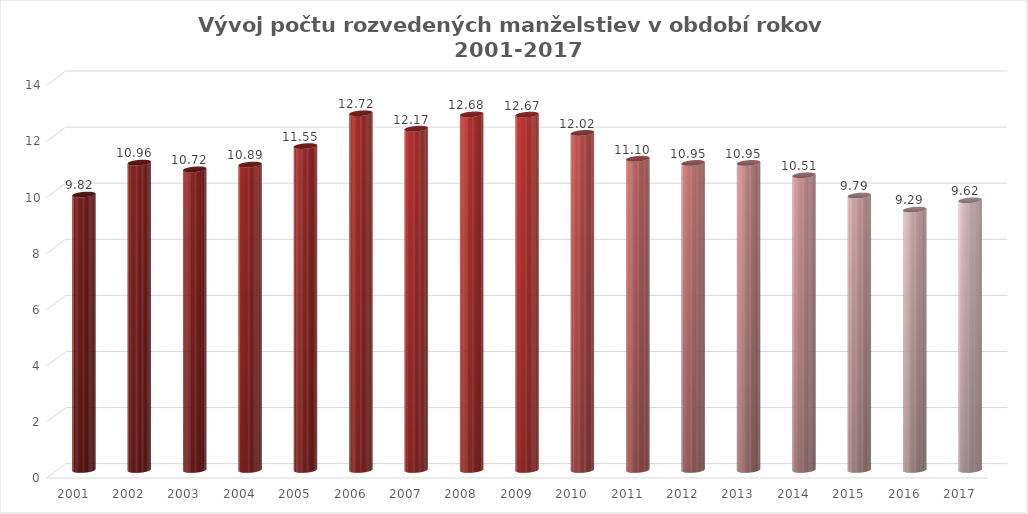
| Category | Series 1 |
|---|---|
| 2001.0 | 9.82 |
| 2002.0 | 10.96 |
| 2003.0 | 10.72 |
| 2004.0 | 10.89 |
| 2005.0 | 11.55 |
| 2006.0 | 12.72 |
| 2007.0 | 12.17 |
| 2008.0 | 12.68 |
| 2009.0 | 12.67 |
| 2010.0 | 12.02 |
| 2011.0 | 11.1 |
| 2012.0 | 10.95 |
| 2013.0 | 10.95 |
| 2014.0 | 10.51 |
| 2015.0 | 9.786 |
| 2016.0 | 9.286 |
| 2017.0 | 9.618 |